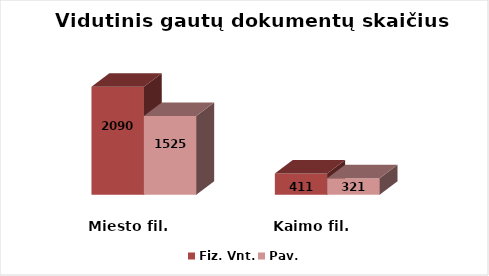
| Category | Fiz. Vnt. | Pav. |
|---|---|---|
| Miesto fil. | 2090 | 1525 |
| Kaimo fil. | 411 | 321 |